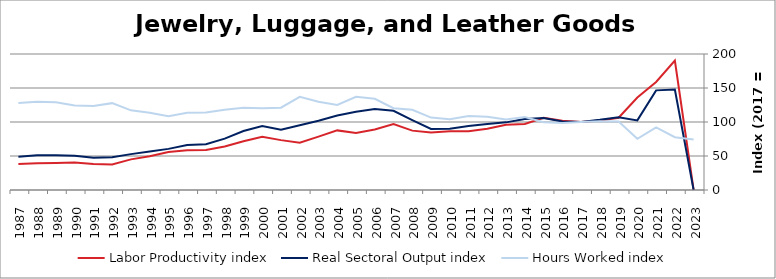
| Category | Labor Productivity index | Real Sectoral Output index | Hours Worked index |
|---|---|---|---|
| 2023.0 | 0 | 0 | 74.337 |
| 2022.0 | 190.228 | 147.754 | 77.672 |
| 2021.0 | 158.888 | 146.533 | 92.224 |
| 2020.0 | 136.034 | 102.366 | 75.25 |
| 2019.0 | 106.272 | 107.147 | 100.824 |
| 2018.0 | 102.2 | 103.184 | 100.963 |
| 2017.0 | 100 | 100 | 100 |
| 2016.0 | 101.973 | 100.621 | 98.674 |
| 2015.0 | 106.27 | 106.021 | 99.766 |
| 2014.0 | 97.222 | 104.313 | 107.293 |
| 2013.0 | 95.893 | 99.464 | 103.723 |
| 2012.0 | 89.96 | 96.901 | 107.716 |
| 2011.0 | 86.415 | 94.14 | 108.94 |
| 2010.0 | 86.389 | 90.025 | 104.208 |
| 2009.0 | 84.406 | 89.889 | 106.496 |
| 2008.0 | 87.296 | 102.886 | 117.859 |
| 2007.0 | 96.859 | 116.527 | 120.306 |
| 2006.0 | 88.927 | 119.25 | 134.098 |
| 2005.0 | 83.818 | 114.928 | 137.116 |
| 2004.0 | 87.656 | 109.662 | 125.105 |
| 2003.0 | 78.464 | 101.908 | 129.878 |
| 2002.0 | 69.556 | 95.323 | 137.045 |
| 2001.0 | 73.336 | 88.764 | 121.037 |
| 2000.0 | 78.236 | 93.958 | 120.095 |
| 1999.0 | 71.781 | 86.718 | 120.808 |
| 1998.0 | 63.911 | 75.477 | 118.097 |
| 1997.0 | 58.908 | 67.232 | 114.13 |
| 1996.0 | 58.417 | 66.309 | 113.51 |
| 1995.0 | 55.754 | 60.492 | 108.498 |
| 1994.0 | 49.771 | 56.516 | 113.55 |
| 1993.0 | 45.034 | 52.75 | 117.135 |
| 1992.0 | 37.684 | 48.136 | 127.737 |
| 1991.0 | 38.309 | 47.323 | 123.53 |
| 1990.0 | 40.377 | 50.229 | 124.398 |
| 1989.0 | 39.588 | 51.052 | 128.959 |
| 1988.0 | 39.342 | 51.105 | 129.899 |
| 1987.0 | 38.259 | 48.891 | 127.789 |